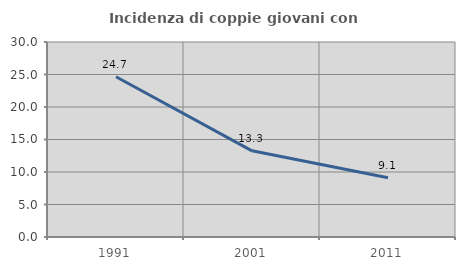
| Category | Incidenza di coppie giovani con figli |
|---|---|
| 1991.0 | 24.653 |
| 2001.0 | 13.256 |
| 2011.0 | 9.127 |